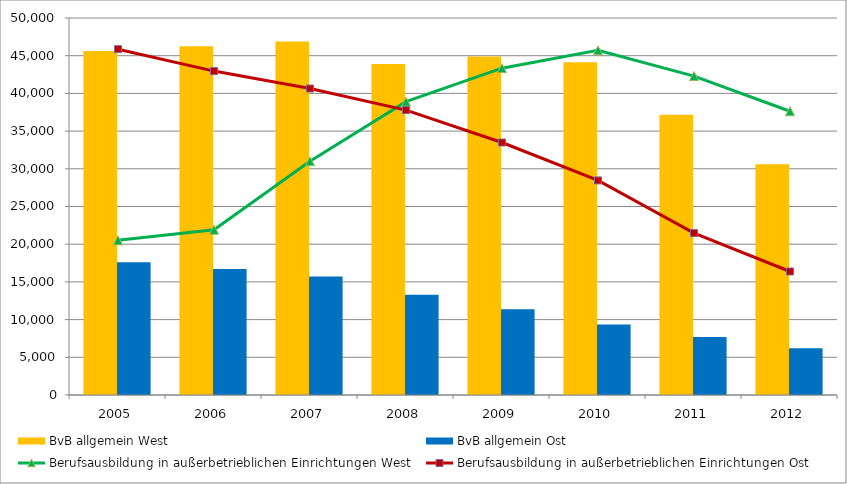
| Category | BvB allgemein West | BvB allgemein Ost |
|---|---|---|
| 2005.0 | 45627 | 17596 |
| 2006.0 | 46251 | 16715 |
| 2007.0 | 46887 | 15717 |
| 2008.0 | 43902 | 13309 |
| 2009.0 | 44908 | 11364 |
| 2010.0 | 44137 | 9337 |
| 2011.0 | 37181.167 | 7679 |
| 2012.0 | 30620 | 6185 |